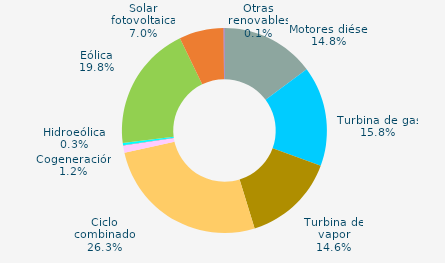
| Category | Series 0 |
|---|---|
| Motores diésel | 14.799 |
| Turbina de gas | 15.804 |
| Turbina de vapor | 14.647 |
| Ciclo combinado | 26.263 |
| Cogeneración | 1.159 |
| Hidráulica | 0.046 |
| Hidroeólica | 0.344 |
| Eólica | 19.776 |
| Solar fotovoltaica | 7.02 |
| Otras renovables | 0.143 |